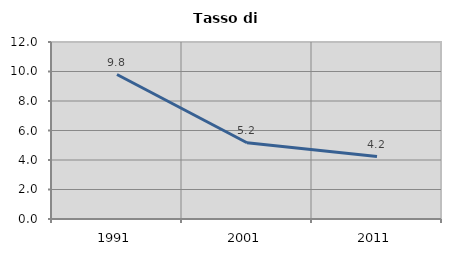
| Category | Tasso di disoccupazione   |
|---|---|
| 1991.0 | 9.794 |
| 2001.0 | 5.171 |
| 2011.0 | 4.235 |